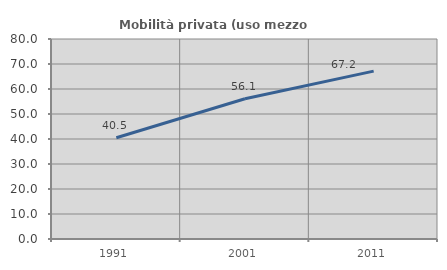
| Category | Mobilità privata (uso mezzo privato) |
|---|---|
| 1991.0 | 40.509 |
| 2001.0 | 56.087 |
| 2011.0 | 67.159 |